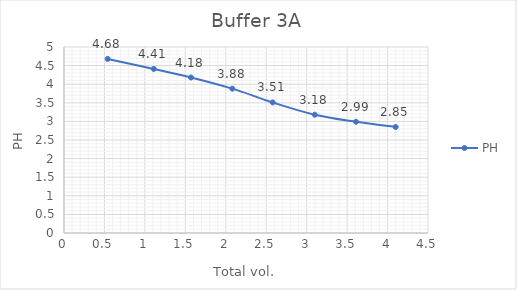
| Category | PH |
|---|---|
| 0.5400000000000001 | 4.68 |
| 1.1099999999999999 | 4.41 |
| 1.5699999999999998 | 4.18 |
| 2.08 | 3.88 |
| 2.58 | 3.51 |
| 3.1 | 3.18 |
| 3.6100000000000003 | 2.99 |
| 4.1 | 2.85 |